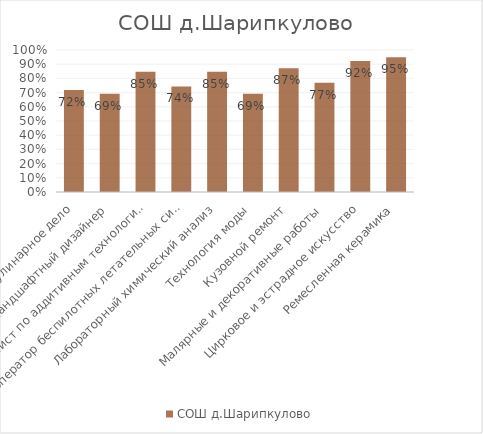
| Category | СОШ д.Шарипкулово |
|---|---|
| Кулинарное дело | 0.718 |
| Ландшафтный дизайнер | 0.692 |
| Специалист по аддитивным технологиям | 0.846 |
| Оператор беспилотных летательных систем | 0.744 |
| Лабораторный химический анализ | 0.846 |
| Технология моды | 0.692 |
| Кузовной ремонт | 0.872 |
| Малярные и декоративные работы | 0.769 |
| Цирковое и эстрадное искусство | 0.923 |
| Ремесленная керамика | 0.949 |